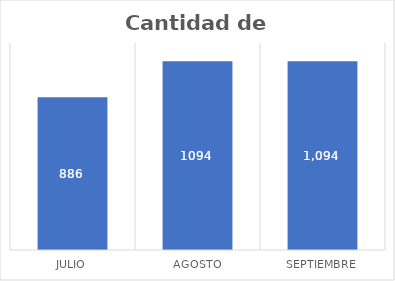
| Category | Cantidad de Pagos |
|---|---|
| Julio | 886 |
| Agosto | 1094 |
| Septiembre | 1094 |